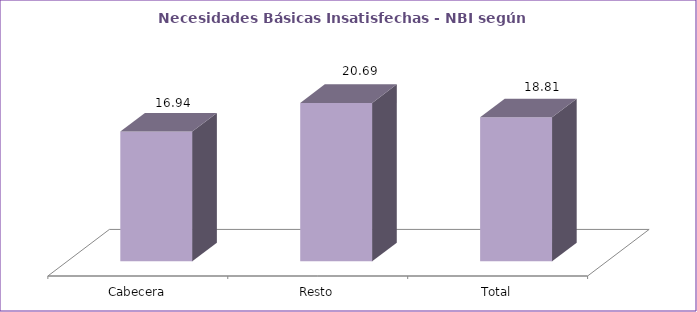
| Category | Series 0 |
|---|---|
| Cabecera | 16.94 |
| Resto | 20.69 |
| Total | 18.81 |